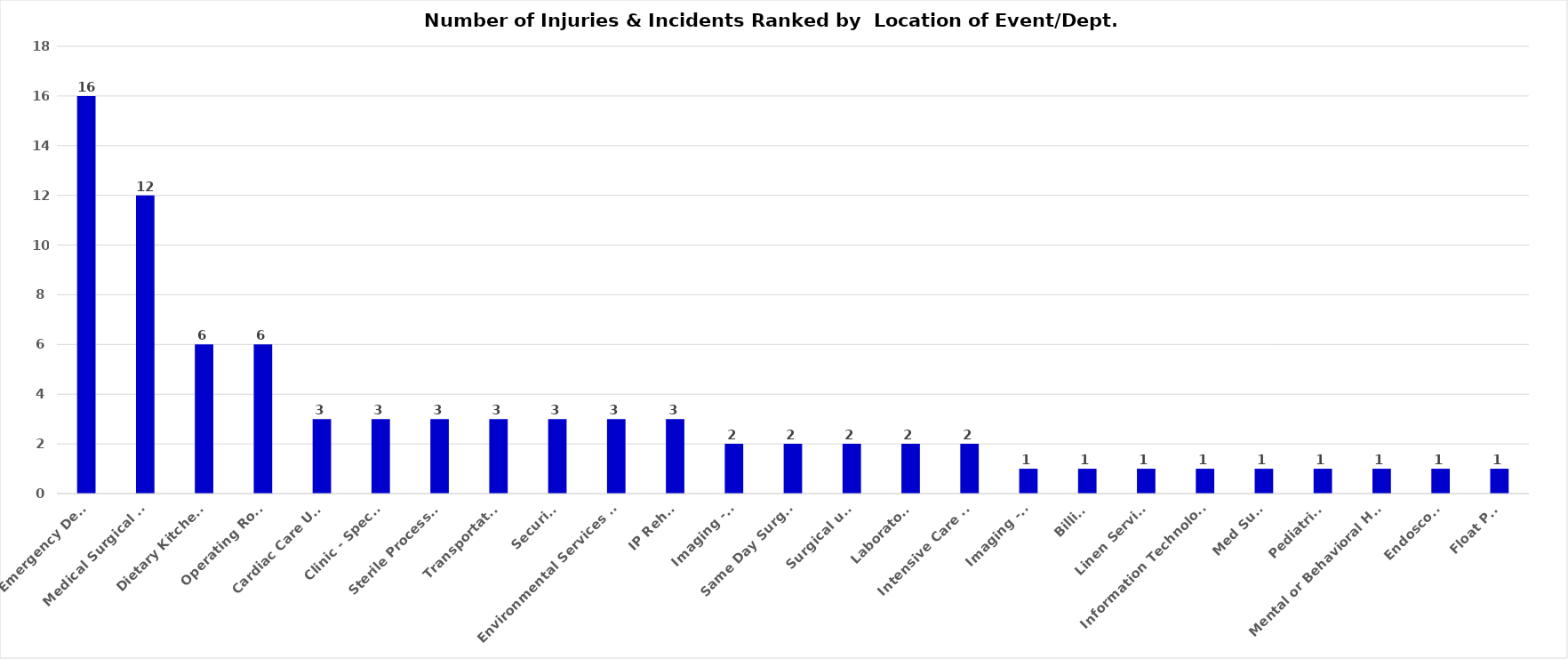
| Category | Total |
|---|---|
| Emergency Dept. | 16 |
| Medical Surgical Unit | 12 |
| Dietary Kitchen    | 6 |
| Operating Room | 6 |
| Cardiac Care Unit | 3 |
| Clinic - Specify | 3 |
| Sterile Processing | 3 |
| Transportation | 3 |
| Security | 3 |
| Environmental Services EVS | 3 |
| IP Rehab | 3 |
| Imaging -CT | 2 |
| Same Day Surgery | 2 |
| Surgical unit | 2 |
| Laboratory  | 2 |
| Intensive Care Unit | 2 |
| Imaging -MRI | 1 |
| Billing | 1 |
| Linen Services | 1 |
| Information Technology IT | 1 |
| Med Surg | 1 |
| Pediatrics | 1 |
| Mental or Behavioral Health | 1 |
| Endoscopy | 1 |
| Float Pool | 1 |